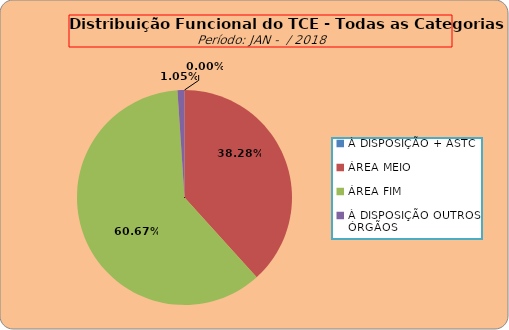
| Category | Series 0 |
|---|---|
| À DISPOSIÇÃO + ASTC | 0 |
| ÁREA MEIO | 183 |
| ÁREA FIM | 290 |
| À DISPOSIÇÃO OUTROS ÓRGÃOS | 5 |